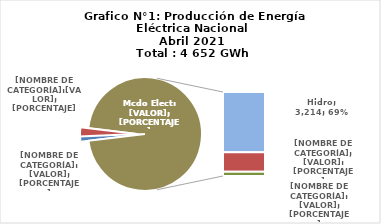
| Category | Series 0 |
|---|---|
| 0 | 55.843 |
| 1 | 122.458 |
| 2 | 3213.884 |
| 3 | 1036.256 |
| 4 | 223.62 |